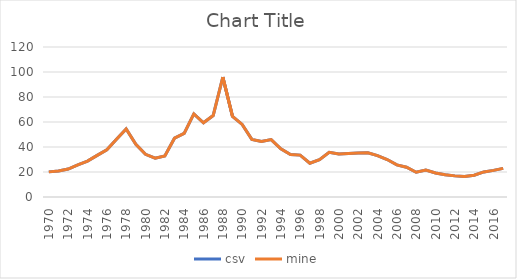
| Category | csv | mine |
|---|---|---|
| 1970 | 20.098 | 20.098 |
| 1971 | 20.805 | 20.805 |
| 1972 | 22.331 | 22.331 |
| 1973 | 25.766 | 25.766 |
| 1974 | 28.677 | 28.677 |
| 1975 | 33.327 | 33.327 |
| 1976 | 37.787 | 37.787 |
| 1977 | 46.229 | 46.229 |
| 1978 | 54.514 | 54.514 |
| 1979 | 42.223 | 42.223 |
| 1980 | 34.165 | 34.165 |
| 1981 | 31.034 | 31.034 |
| 1982 | 32.812 | 32.812 |
| 1983 | 47.032 | 47.032 |
| 1984 | 50.937 | 50.937 |
| 1985 | 66.49 | 66.49 |
| 1986 | 59.396 | 59.396 |
| 1987 | 65.198 | 65.198 |
| 1988 | 95.94 | 95.94 |
| 1989 | 64.458 | 64.458 |
| 1990 | 58.026 | 58.026 |
| 1991 | 46.104 | 46.104 |
| 1992 | 44.451 | 44.451 |
| 1993 | 45.924 | 45.924 |
| 1994 | 38.535 | 38.535 |
| 1995 | 33.988 | 33.988 |
| 1996 | 33.515 | 33.515 |
| 1997 | 27.038 | 27.038 |
| 1998 | 29.935 | 29.935 |
| 1999 | 35.71 | 35.71 |
| 2000 | 34.476 | 34.476 |
| 2001 | 34.84 | 34.84 |
| 2002 | 35.286 | 35.286 |
| 2003 | 35.34 | 35.34 |
| 2004 | 33.065 | 33.065 |
| 2005 | 30.003 | 30.003 |
| 2006 | 25.722 | 25.722 |
| 2007 | 23.85 | 23.85 |
| 2008 | 19.833 | 19.833 |
| 2009 | 21.538 | 21.538 |
| 2010 | 19.266 | 19.266 |
| 2011 | 17.833 | 17.833 |
| 2012 | 16.901 | 16.901 |
| 2013 | 16.381 | 16.381 |
| 2014 | 17.413 | 17.413 |
| 2015 | 20.083 | 20.083 |
| 2016 | 21.309 | 21.309 |
| 2017 | 22.91 | 22.91 |